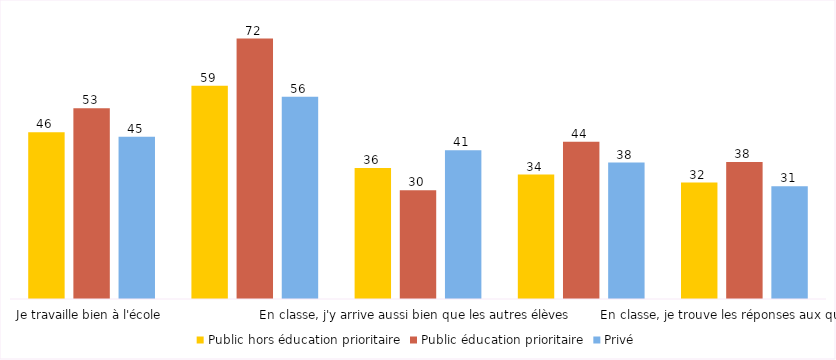
| Category | Public hors éducation prioritaire | Public éducation prioritaire | Privé |
|---|---|---|---|
| Je travaille bien à l'école | 46.17 | 52.83 | 44.93 |
| Je suis content de moi | 59.01 | 72.1 | 56 |
| En classe, j'y arrive aussi bien que les autres élèves | 36.29 | 30.09 | 41.19 |
| Je me rappelle facilement ce que j'apprends à l'école | 34.43 | 43.53 | 37.78 |
| En classe, je trouve les réponses aux questions | 32.24 | 37.94 | 31.22 |